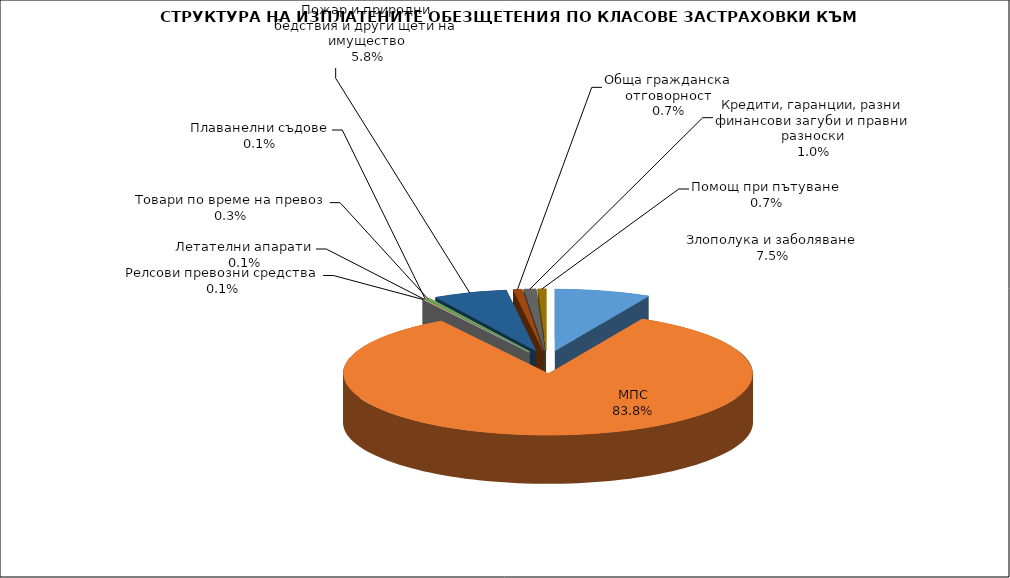
| Category | Злополука и заболяване |
|---|---|
| Злополука и заболяване | 0.075 |
| МПС | 0.838 |
| Релсови превозни средства | 0.001 |
| Летателни апарати | 0.001 |
| Плаванелни съдове | 0.001 |
| Товари по време на превоз | 0.003 |
| Пожар и природни бедствия и други щети на имущество | 0.058 |
| Обща гражданска отговорност | 0.007 |
| Кредити, гаранции, разни финансови загуби и правни разноски | 0.01 |
| Помощ при пътуване | 0.007 |